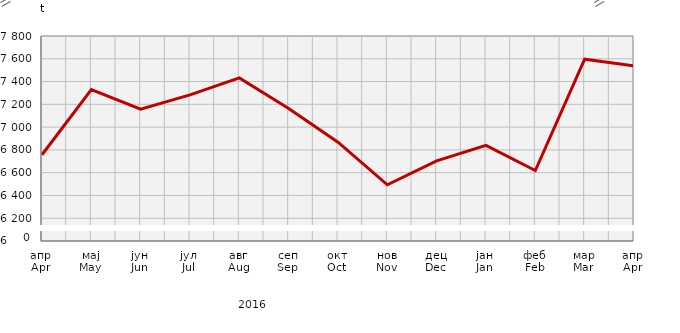
| Category | Прикупљање крављег млијека
Collecting of cow’s milk |
|---|---|
| апр
Apr | 6757.289 |
| мај
May | 7329.328 |
| јун
Jun | 7158.306 |
| јул
Jul | 7282.65 |
| авг
Aug | 7431.863 |
| сеп
Sep | 7163.964 |
| окт
Oct | 6867.986 |
| нов
Nov | 6493.2 |
| дец
Dec | 6703.986 |
| јан
Jan | 6839.677 |
| феб
Feb | 6618.5 |
| мар
Mar | 7595.98 |
| апр
Apr | 7537.768 |